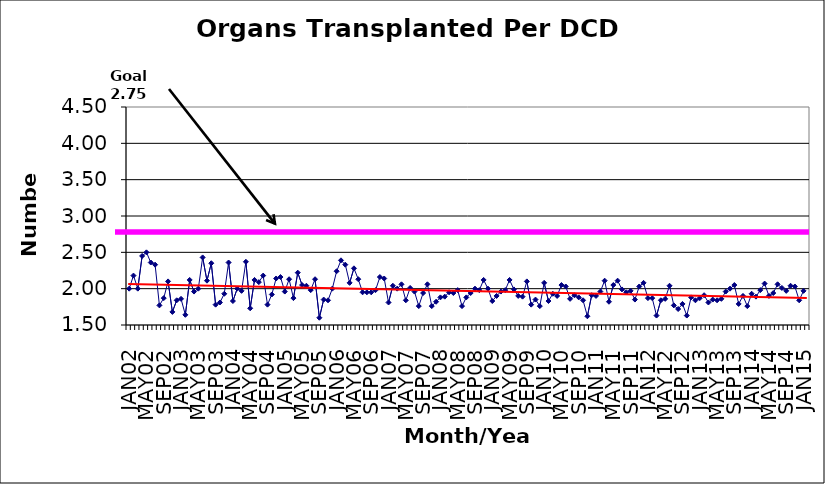
| Category | Series 0 |
|---|---|
| JAN02 | 2 |
| FEB02 | 2.18 |
| MAR02 | 2 |
| APR02 | 2.45 |
| MAY02 | 2.5 |
| JUN02 | 2.36 |
| JUL02 | 2.33 |
| AUG02 | 1.77 |
| SEP02 | 1.87 |
| OCT02 | 2.1 |
| NOV02 | 1.68 |
| DEC02 | 1.84 |
| JAN03 | 1.86 |
| FEB03 | 1.64 |
| MAR03 | 2.12 |
| APR03 | 1.96 |
| MAY03 | 2 |
| JUN03 | 2.43 |
| JUL03 | 2.11 |
| AUG03 | 2.35 |
| SEP03 | 1.78 |
| OCT03 | 1.81 |
| NOV03 | 1.93 |
| DEC03 | 2.36 |
| JAN04 | 1.83 |
| FEB04 | 2 |
| MAR04 | 1.97 |
| APR04 | 2.37 |
| MAY04 | 1.73 |
| JUN04 | 2.12 |
| JUL04 | 2.09 |
| AUG04 | 2.18 |
| SEP04 | 1.78 |
| OCT04 | 1.92 |
| NOV04 | 2.14 |
| DEC04 | 2.16 |
| JAN05 | 1.96 |
| FEB05 | 2.13 |
| MAR05 | 1.87 |
| APR05 | 2.22 |
| MAY05 | 2.05 |
| JUN05 | 2.04 |
| JUL05 | 1.98 |
| AUG05 | 2.13 |
| SEP05 | 1.6 |
| OCT05 | 1.85 |
| NOV05 | 1.84 |
| DEC05 | 2 |
| JAN06 | 2.24 |
| FEB06 | 2.39 |
| MAR06 | 2.33 |
| APR06 | 2.08 |
| MAY06 | 2.28 |
| JUN06 | 2.13 |
| JUL06 | 1.95 |
| AUG06 | 1.95 |
| SEP06 | 1.95 |
| OCT06 | 1.98 |
| NOV06 | 2.16 |
| DEC06 | 2.14 |
| JAN07 | 1.81 |
| FEB07 | 2.04 |
| MAR07 | 2 |
| APR07 | 2.06 |
| MAY07 | 1.84 |
| JUN07 | 2.01 |
| JUL07 | 1.96 |
| AUG07 | 1.76 |
| SEP07 | 1.94 |
| OCT07 | 2.06 |
| NOV07 | 1.76 |
| DEC07 | 1.82 |
| JAN08 | 1.88 |
| FEB08 | 1.89 |
| MAR08 | 1.95 |
| APR08 | 1.94 |
| MAY08 | 1.98 |
| JUN08 | 1.76 |
| JUL08 | 1.88 |
| AUG08 | 1.94 |
| SEP08 | 2 |
| OCT08 | 1.98 |
| NOV08 | 2.12 |
| DEC08 | 2 |
| JAN09 | 1.83 |
| FEB09 | 1.9 |
| MAR09 | 1.96 |
| APR09 | 1.98 |
| MAY09 | 2.12 |
| JUN09 | 1.99 |
| JUL09 | 1.9 |
| AUG09 | 1.89 |
| SEP09 | 2.1 |
| OCT09 | 1.78 |
| NOV09 | 1.85 |
| DEC09 | 1.76 |
| JAN10 | 2.08 |
| FEB10 | 1.83 |
| MAR10 | 1.93 |
| APR10 | 1.9 |
| MAY10 | 2.05 |
| JUN10 | 2.03 |
| JUL10 | 1.86 |
| AUG10 | 1.91 |
| SEP10 | 1.88 |
| OCT10 | 1.84 |
| NOV10 | 1.62 |
| DEC10 | 1.91 |
| JAN11 | 1.9 |
| FEB11 | 1.96 |
| MAR11 | 2.11 |
| APR11 | 1.82 |
| MAY11 | 2.05 |
| JUN11 | 2.11 |
| JUL11 | 1.99 |
| AUG11 | 1.95 |
| SEP11 | 1.97 |
| OCT11 | 1.85 |
| NOV11 | 2.03 |
| DEC11 | 2.08 |
| JAN12 | 1.87 |
| FEB12 | 1.87 |
| MAR12 | 1.63 |
| APR12 | 1.84 |
| MAY12 | 1.86 |
| JUN12 | 2.04 |
| JUL12 | 1.77 |
| AUG12 | 1.72 |
| SEP12 | 1.79 |
| OCT12 | 1.63 |
| NOV12 | 1.88 |
| DEC12 | 1.84 |
| JAN13 | 1.87 |
| FEB13 | 1.91 |
| MAR13 | 1.81 |
| APR13 | 1.85 |
| MAY13 | 1.84 |
| JUN13 | 1.86 |
| JUL13 | 1.96 |
| AUG13 | 2 |
| SEP13 | 2.05 |
| OCT13 | 1.79 |
| NOV13 | 1.9 |
| DEC13 | 1.76 |
| JAN14 | 1.93 |
| FEB14 | 1.89 |
| MAR14 | 1.98 |
| APR14 | 2.07 |
| MAY14 | 1.9 |
| JUN14 | 1.94 |
| JUL14 | 2.06 |
| AUG14 | 2.01 |
| SEP14 | 1.97 |
| OCT14 | 2.04 |
| NOV14 | 2.03 |
| DEC14 | 1.84 |
| JAN15 | 1.97 |